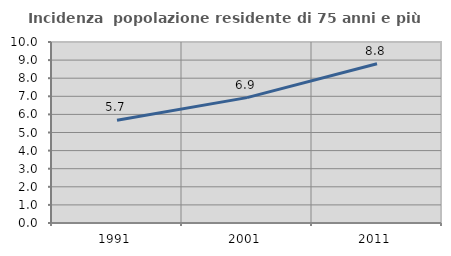
| Category | Incidenza  popolazione residente di 75 anni e più |
|---|---|
| 1991.0 | 5.676 |
| 2001.0 | 6.928 |
| 2011.0 | 8.801 |